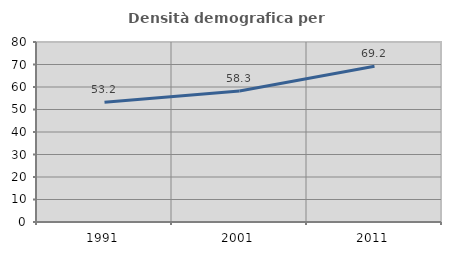
| Category | Densità demografica |
|---|---|
| 1991.0 | 53.2 |
| 2001.0 | 58.256 |
| 2011.0 | 69.181 |